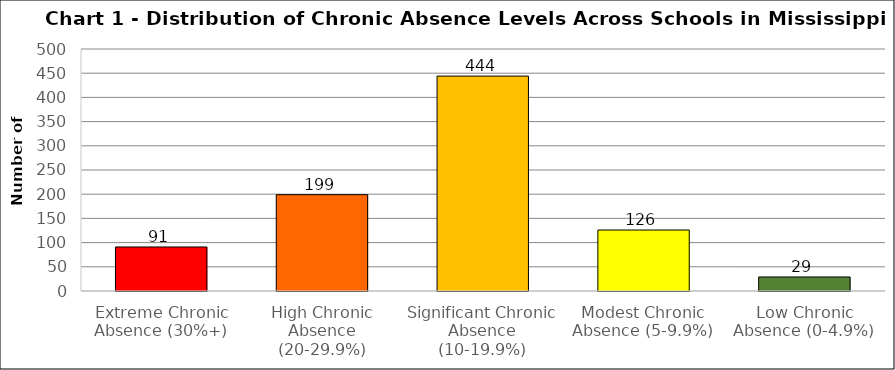
| Category | Series 0 |
|---|---|
| Extreme Chronic Absence (30%+) | 91 |
| High Chronic Absence (20-29.9%) | 199 |
| Significant Chronic Absence (10-19.9%) | 444 |
| Modest Chronic Absence (5-9.9%) | 126 |
| Low Chronic Absence (0-4.9%) | 29 |